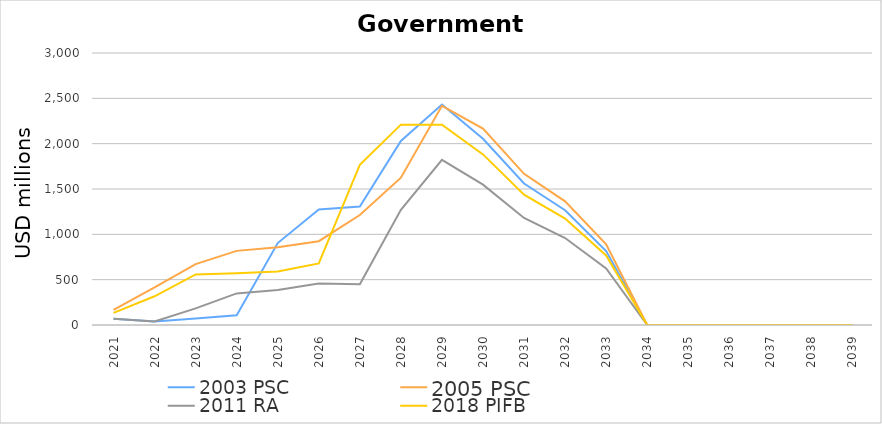
| Category | 2003 PSC | 2005 PSC | 2011 RA | 2018 PIFB |
|---|---|---|---|---|
| 2021.0 | 69.886 | 168.077 | 69.886 | 133.797 |
| 2022.0 | 39.952 | 413.863 | 39.952 | 316.955 |
| 2023.0 | 70.691 | 672.103 | 182.965 | 558.275 |
| 2024.0 | 106.237 | 817.613 | 348.755 | 570.363 |
| 2025.0 | 903.409 | 856.67 | 384.826 | 590.29 |
| 2026.0 | 1274.498 | 924.59 | 456.692 | 678.489 |
| 2027.0 | 1305.676 | 1213.054 | 449.954 | 1766.581 |
| 2028.0 | 2029.928 | 1624.818 | 1269.857 | 2209.836 |
| 2029.0 | 2430.836 | 2417.499 | 1821.206 | 2209.794 |
| 2030.0 | 2053.928 | 2167.013 | 1547.704 | 1881.627 |
| 2031.0 | 1560.571 | 1667.354 | 1180.245 | 1438.06 |
| 2032.0 | 1265.637 | 1363.56 | 959.625 | 1173.402 |
| 2033.0 | 816.312 | 889.462 | 623.65 | 767.34 |
| 2034.0 | 0 | 0 | 0 | 0.25 |
| 2035.0 | 0 | 0 | 0 | 0.122 |
| 2036.0 | 0 | 0 | 0 | 0.021 |
| 2037.0 | 0 | 0 | 0 | 0 |
| 2038.0 | 0 | 0 | 0 | 0 |
| 2039.0 | 0 | 0 | 0 | 0 |